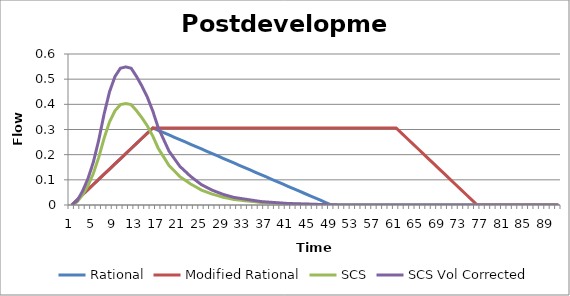
| Category | Rational | Modified Rational | SCS | SCS Vol Corrected |
|---|---|---|---|---|
| 0 | 0 | 0 | 0 | 0 |
| 1 | 0.02 | 0.02 | 0.012 | 0.016 |
| 2 | 0.041 | 0.041 | 0.04 | 0.055 |
| 3 | 0.061 | 0.061 | 0.077 | 0.104 |
| 4 | 0.082 | 0.082 | 0.125 | 0.17 |
| 5 | 0.102 | 0.102 | 0.189 | 0.258 |
| 6 | 0.122 | 0.122 | 0.266 | 0.362 |
| 7 | 0.143 | 0.143 | 0.33 | 0.45 |
| 8 | 0.163 | 0.163 | 0.375 | 0.51 |
| 9 | 0.184 | 0.184 | 0.399 | 0.543 |
| 10 | 0.204 | 0.204 | 0.403 | 0.549 |
| 11 | 0.224 | 0.224 | 0.399 | 0.543 |
| 12 | 0.245 | 0.245 | 0.375 | 0.51 |
| 13 | 0.265 | 0.265 | 0.346 | 0.472 |
| 14 | 0.286 | 0.286 | 0.314 | 0.428 |
| 15 | 0.306 | 0.306 | 0.274 | 0.373 |
| 16 | 0.297 | 0.306 | 0.226 | 0.307 |
| 17 | 0.287 | 0.306 | 0.191 | 0.261 |
| 18 | 0.278 | 0.306 | 0.157 | 0.214 |
| 19 | 0.269 | 0.306 | 0.135 | 0.184 |
| 20 | 0.26 | 0.306 | 0.113 | 0.154 |
| 21 | 0.25 | 0.306 | 0.098 | 0.134 |
| 22 | 0.241 | 0.306 | 0.083 | 0.114 |
| 23 | 0.232 | 0.306 | 0.071 | 0.097 |
| 24 | 0.223 | 0.306 | 0.059 | 0.081 |
| 25 | 0.213 | 0.306 | 0.051 | 0.07 |
| 26 | 0.204 | 0.306 | 0.043 | 0.059 |
| 27 | 0.195 | 0.306 | 0.037 | 0.05 |
| 28 | 0.186 | 0.306 | 0.031 | 0.042 |
| 29 | 0.176 | 0.306 | 0.027 | 0.036 |
| 30 | 0.167 | 0.306 | 0.022 | 0.03 |
| 31 | 0.158 | 0.306 | 0.02 | 0.027 |
| 32 | 0.149 | 0.306 | 0.017 | 0.024 |
| 33 | 0.139 | 0.306 | 0.015 | 0.02 |
| 34 | 0.13 | 0.306 | 0.012 | 0.017 |
| 35 | 0.121 | 0.306 | 0.01 | 0.014 |
| 36 | 0.112 | 0.306 | 0.009 | 0.012 |
| 37 | 0.102 | 0.306 | 0.008 | 0.011 |
| 38 | 0.093 | 0.306 | 0.007 | 0.009 |
| 39 | 0.084 | 0.306 | 0.006 | 0.008 |
| 40 | 0.074 | 0.306 | 0.004 | 0.006 |
| 41 | 0.065 | 0.306 | 0.004 | 0.005 |
| 42 | 0.056 | 0.306 | 0.003 | 0.005 |
| 43 | 0.047 | 0.306 | 0.003 | 0.004 |
| 44 | 0.037 | 0.306 | 0.002 | 0.003 |
| 45 | 0.028 | 0.306 | 0.002 | 0.003 |
| 46 | 0.019 | 0.306 | 0.002 | 0.002 |
| 47 | 0.01 | 0.306 | 0.001 | 0.002 |
| 48 | 0 | 0.306 | 0.001 | 0.001 |
| 49 | 0 | 0.306 | 0 | 0.001 |
| 50 | 0 | 0.306 | 0 | 0 |
| 51 | 0 | 0.306 | 0 | 0 |
| 52 | 0 | 0.306 | 0 | 0 |
| 53 | 0 | 0.306 | 0 | 0 |
| 54 | 0 | 0.306 | 0 | 0 |
| 55 | 0 | 0.306 | 0 | 0 |
| 56 | 0 | 0.306 | 0 | 0 |
| 57 | 0 | 0.306 | 0 | 0 |
| 58 | 0 | 0.306 | 0 | 0 |
| 59 | 0 | 0.306 | 0 | 0 |
| 60 | 0 | 0.306 | 0 | 0 |
| 61 | 0 | 0.286 | 0 | 0 |
| 62 | 0 | 0.265 | 0 | 0 |
| 63 | 0 | 0.245 | 0 | 0 |
| 64 | 0 | 0.224 | 0 | 0 |
| 65 | 0 | 0.204 | 0 | 0 |
| 66 | 0 | 0.184 | 0 | 0 |
| 67 | 0 | 0.163 | 0 | 0 |
| 68 | 0 | 0.143 | 0 | 0 |
| 69 | 0 | 0.122 | 0 | 0 |
| 70 | 0 | 0.102 | 0 | 0 |
| 71 | 0 | 0.082 | 0 | 0 |
| 72 | 0 | 0.061 | 0 | 0 |
| 73 | 0 | 0.041 | 0 | 0 |
| 74 | 0 | 0.02 | 0 | 0 |
| 75 | 0 | 0 | 0 | 0 |
| 76 | 0 | 0 | 0 | 0 |
| 77 | 0 | 0 | 0 | 0 |
| 78 | 0 | 0 | 0 | 0 |
| 79 | 0 | 0 | 0 | 0 |
| 80 | 0 | 0 | 0 | 0 |
| 81 | 0 | 0 | 0 | 0 |
| 82 | 0 | 0 | 0 | 0 |
| 83 | 0 | 0 | 0 | 0 |
| 84 | 0 | 0 | 0 | 0 |
| 85 | 0 | 0 | 0 | 0 |
| 86 | 0 | 0 | 0 | 0 |
| 87 | 0 | 0 | 0 | 0 |
| 88 | 0 | 0 | 0 | 0 |
| 89 | 0 | 0 | 0 | 0 |
| 90 | 0 | 0 | 0 | 0 |